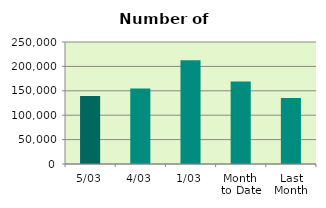
| Category | Series 0 |
|---|---|
| 5/03 | 139508 |
| 4/03 | 154566 |
| 1/03 | 212470 |
| Month 
to Date | 168848 |
| Last
Month | 135041.7 |